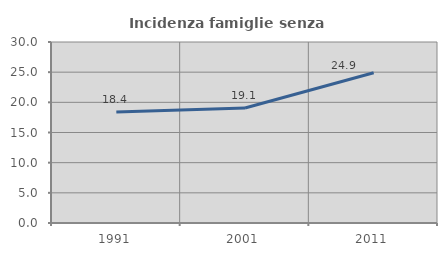
| Category | Incidenza famiglie senza nuclei |
|---|---|
| 1991.0 | 18.405 |
| 2001.0 | 19.057 |
| 2011.0 | 24.911 |